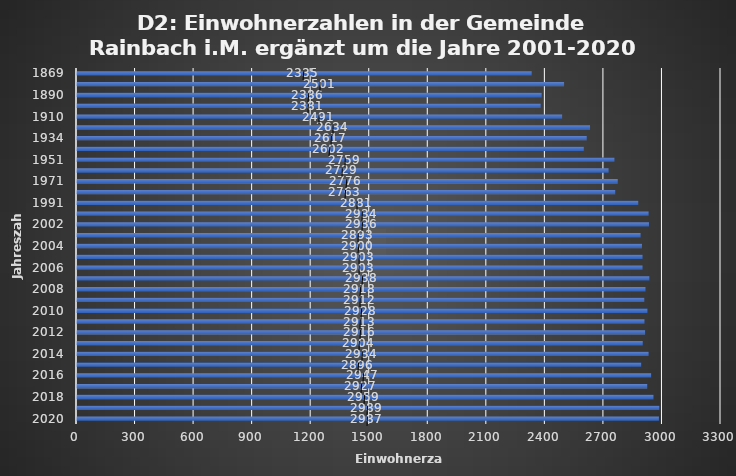
| Category | Einwohnerzahl |
|---|---|
| 2020 | 2987 |
| 2019 | 2989 |
| 2018 | 2959 |
| 2017 | 2927 |
| 2016 | 2947 |
| 2015 | 2896 |
| 2014 | 2934 |
| 2013 | 2904 |
| 2012 | 2916 |
| 2011 | 2913 |
| 2010 | 2928 |
| 2009 | 2912 |
| 2008 | 2918 |
| 2007 | 2938 |
| 2006 | 2903 |
| 2005 | 2903 |
| 2004 | 2900 |
| 2003 | 2893 |
| 2002 | 2936 |
| 2001 | 2934 |
| 1991 | 2881 |
| 1981 | 2763 |
| 1971 | 2776 |
| 1961 | 2729 |
| 1951 | 2759 |
| 1939 | 2602 |
| 1934 | 2617 |
| 1923 | 2634 |
| 1910 | 2491 |
| 1900 | 2381 |
| 1890 | 2386 |
| 1880 | 2501 |
| 1869 | 2335 |